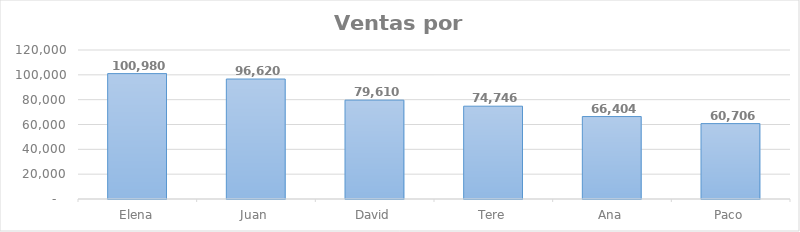
| Category | Total |
|---|---|
| Elena | 100980 |
| Juan | 96620 |
| David | 79610 |
| Tere | 74746 |
| Ana | 66404 |
| Paco | 60706 |